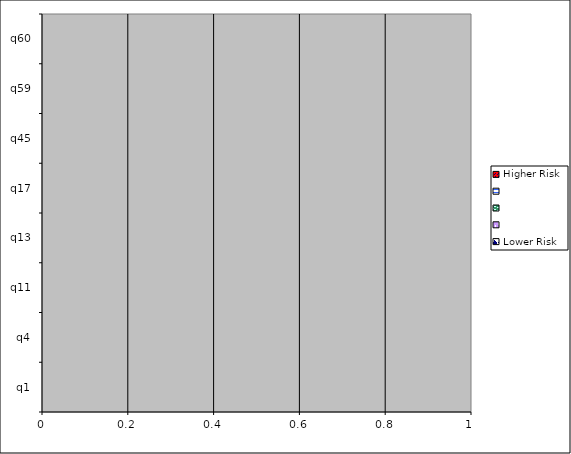
| Category | Higher Risk |   | Lower Risk |
|---|---|---|---|
| q1 | 0 | 0 | 0 |
| q4 | 0 | 0 | 0 |
| q11 | 0 | 0 | 0 |
| q13 | 0 | 0 | 0 |
| q17 | 0 | 0 | 0 |
| q45 | 0 | 0 | 0 |
| q59 | 0 | 0 | 0 |
| q60 | 0 | 0 | 0 |